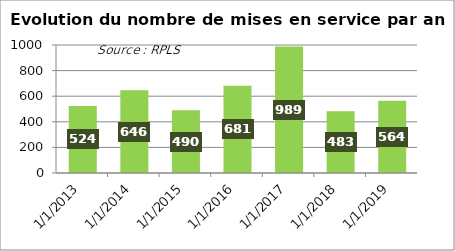
| Category | Series 0 |
|---|---|
| 2013-01-01 | 524 |
| 2014-01-01 | 646 |
| 2015-01-01 | 490 |
| 2016-01-01 | 681 |
| 2017-01-01 | 989 |
| 2018-01-01 | 483 |
| 2019-01-01 | 564 |